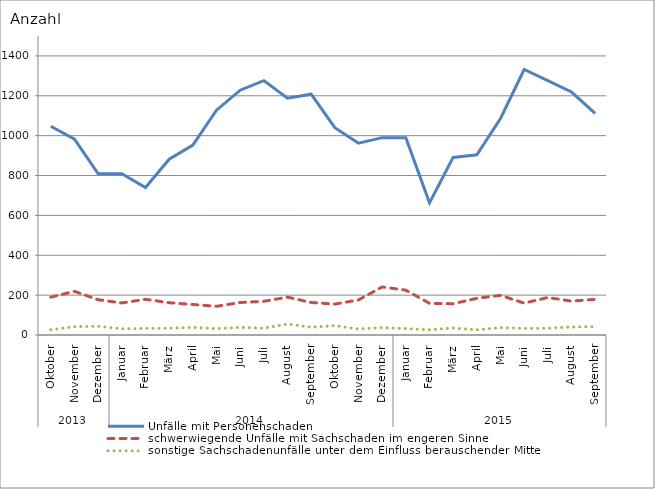
| Category | Unfälle mit Personenschaden | schwerwiegende Unfälle mit Sachschaden im engeren Sinne | sonstige Sachschadenunfälle unter dem Einfluss berauschender Mittel |
|---|---|---|---|
| 0 | 1047 | 190 | 26 |
| 1 | 983 | 219 | 42 |
| 2 | 809 | 177 | 44 |
| 3 | 809 | 161 | 31 |
| 4 | 740 | 179 | 33 |
| 5 | 882 | 162 | 34 |
| 6 | 953 | 153 | 38 |
| 7 | 1128 | 144 | 32 |
| 8 | 1228 | 163 | 38 |
| 9 | 1276 | 169 | 34 |
| 10 | 1188 | 190 | 55 |
| 11 | 1208 | 163 | 39 |
| 12 | 1040 | 155 | 47 |
| 13 | 962 | 176 | 30 |
| 14 | 990 | 241 | 37 |
| 15 | 990 | 225 | 32 |
| 16 | 663 | 159 | 26 |
| 17 | 891 | 157 | 35 |
| 18 | 904 | 184 | 26 |
| 19 | 1086 | 199 | 37 |
| 20 | 1332 | 160 | 33 |
| 21 | 1276 | 188 | 34 |
| 22 | 1219 | 170 | 40 |
| 23 | 1112 | 179 | 42 |